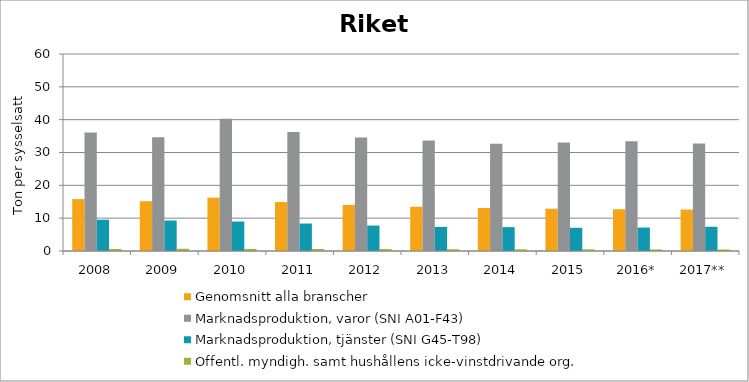
| Category | Genomsnitt alla branscher | Marknadsproduktion, varor (SNI A01-F43) | Marknadsproduktion, tjänster (SNI G45-T98) | Offentl. myndigh. samt hushållens icke-vinstdrivande org. |
|---|---|---|---|---|
| 2008 | 15.803 | 36.096 | 9.523 | 0.617 |
| 2009 | 15.157 | 34.67 | 9.279 | 0.675 |
| 2010 | 16.254 | 40.309 | 8.976 | 0.641 |
| 2011 | 14.907 | 36.277 | 8.366 | 0.604 |
| 2012 | 14.03 | 34.532 | 7.74 | 0.594 |
| 2013 | 13.466 | 33.631 | 7.343 | 0.53 |
| 2014 | 13.09 | 32.685 | 7.271 | 0.509 |
| 2015 | 12.878 | 33.041 | 7.076 | 0.512 |
| 2016* | 12.725 | 33.398 | 7.14 | 0.483 |
| 2017** | 12.626 | 32.722 | 7.384 | 0.465 |